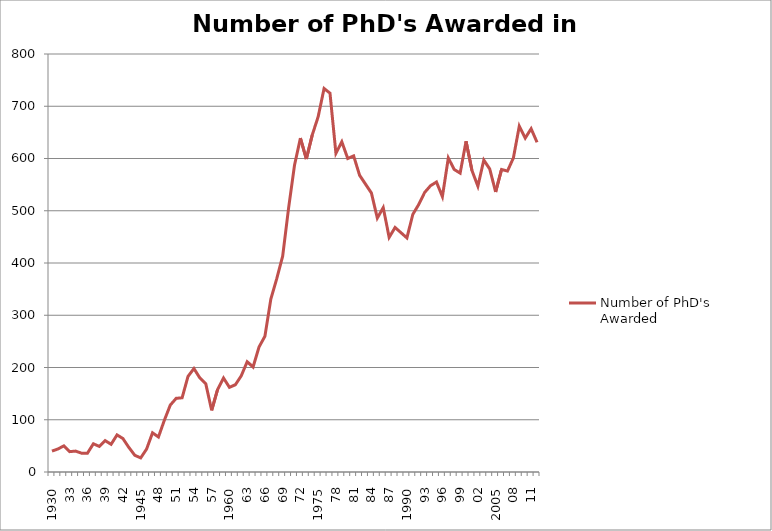
| Category | Number of PhD's Awarded |
|---|---|
| 1930 | 40 |
| 31 | 44 |
| 32 | 50 |
| 33 | 39 |
| 34 | 40 |
| 1935 | 36 |
| 36 | 36 |
| 37 | 54 |
| 38 | 49 |
| 39 | 60 |
| 1940 | 53 |
| 41 | 71 |
| 42 | 64 |
| 43 | 47 |
| 44 | 32 |
| 1945 | 27 |
| 46 | 44 |
| 47 | 75 |
| 48 | 67 |
| 49 | 99 |
| 1950 | 128 |
| 51 | 141 |
| 52 | 142 |
| 53 | 183 |
| 54 | 198 |
| 1955 | 180 |
| 56 | 169 |
| 57 | 118 |
| 58 | 158 |
| 59 | 180 |
| 1960 | 162 |
| 61 | 167 |
| 62 | 184 |
| 63 | 211 |
| 64 | 201 |
| 1965 | 239 |
| 66 | 260 |
| 67 | 331 |
| 68 | 370 |
| 69 | 413 |
| 1970 | 505 |
| 71 | 587 |
| 72 | 639 |
| 73 | 599 |
| 74 | 645 |
| 1975 | 680 |
| 76 | 734 |
| 77 | 725 |
| 78 | 610 |
| 79 | 632 |
| 1980 | 600 |
| 81 | 605 |
| 82 | 568 |
| 83 | 551 |
| 84 | 534 |
| 1985 | 486 |
| 86 | 506 |
| 87 | 449 |
| 88 | 468 |
| 89 | 458 |
| 1990 | 448 |
| 91 | 493 |
| 92 | 512 |
| 93 | 535 |
| 94 | 548 |
| 1995 | 555 |
| 96 | 527 |
| 97 | 601 |
| 98 | 579 |
| 99 | 572 |
| 2000 | 633 |
| 01 | 577 |
| 02 | 547 |
| 03 | 597 |
| 04 | 580 |
| 2005 | 536 |
| 06 | 579 |
| 07 | 576 |
| 08 | 601 |
| 09 | 662 |
| 2010 | 639 |
| 11 | 657 |
| 12 | 631 |